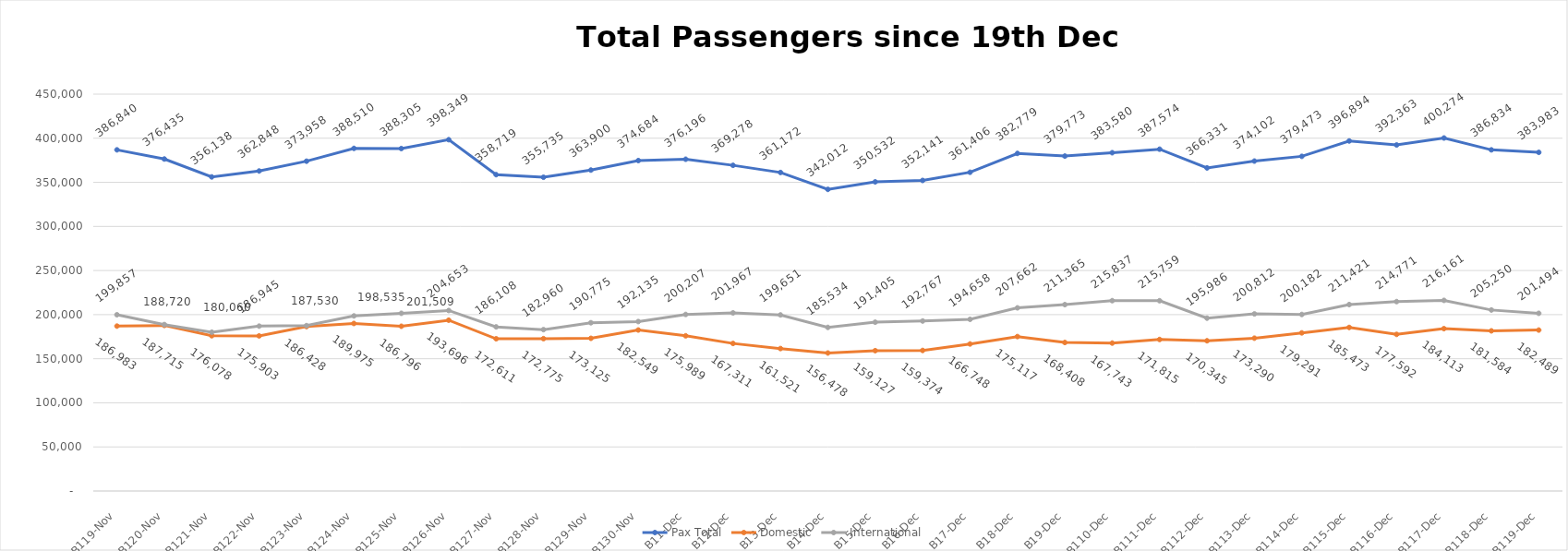
| Category | Pax Total | Domestic | International |
|---|---|---|---|
| 2023-11-19 | 386840 | 186983 | 199857 |
| 2023-11-20 | 376435 | 187715 | 188720 |
| 2023-11-21 | 356138 | 176078 | 180060 |
| 2023-11-22 | 362848 | 175903 | 186945 |
| 2023-11-23 | 373958 | 186428 | 187530 |
| 2023-11-24 | 388510 | 189975 | 198535 |
| 2023-11-25 | 388305 | 186796 | 201509 |
| 2023-11-26 | 398349 | 193696 | 204653 |
| 2023-11-27 | 358719 | 172611 | 186108 |
| 2023-11-28 | 355735 | 172775 | 182960 |
| 2023-11-29 | 363900 | 173125 | 190775 |
| 2023-11-30 | 374684 | 182549 | 192135 |
| 2023-12-01 | 376196 | 175989 | 200207 |
| 2023-12-02 | 369278 | 167311 | 201967 |
| 2023-12-03 | 361172 | 161521 | 199651 |
| 2023-12-04 | 342012 | 156478 | 185534 |
| 2023-12-05 | 350532 | 159127 | 191405 |
| 2023-12-06 | 352141 | 159374 | 192767 |
| 2023-12-07 | 361406 | 166748 | 194658 |
| 2023-12-08 | 382779 | 175117 | 207662 |
| 2023-12-09 | 379773 | 168408 | 211365 |
| 2023-12-10 | 383580 | 167743 | 215837 |
| 2023-12-11 | 387574 | 171815 | 215759 |
| 2023-12-12 | 366331 | 170345 | 195986 |
| 2023-12-13 | 374102 | 173290 | 200812 |
| 2023-12-14 | 379473 | 179291 | 200182 |
| 2023-12-15 | 396894 | 185473 | 211421 |
| 2023-12-16 | 392363 | 177592 | 214771 |
| 2023-12-17 | 400274 | 184113 | 216161 |
| 2023-12-18 | 386834 | 181584 | 205250 |
| 2023-12-19 | 383983 | 182489 | 201494 |